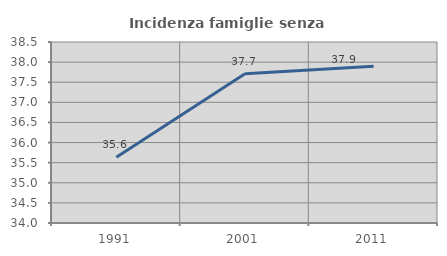
| Category | Incidenza famiglie senza nuclei |
|---|---|
| 1991.0 | 35.632 |
| 2001.0 | 37.709 |
| 2011.0 | 37.895 |